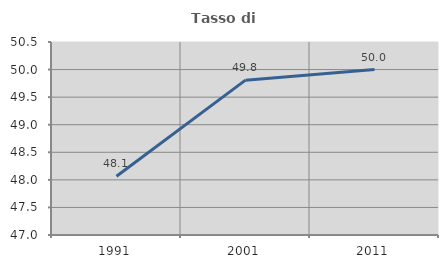
| Category | Tasso di occupazione   |
|---|---|
| 1991.0 | 48.064 |
| 2001.0 | 49.808 |
| 2011.0 | 50 |